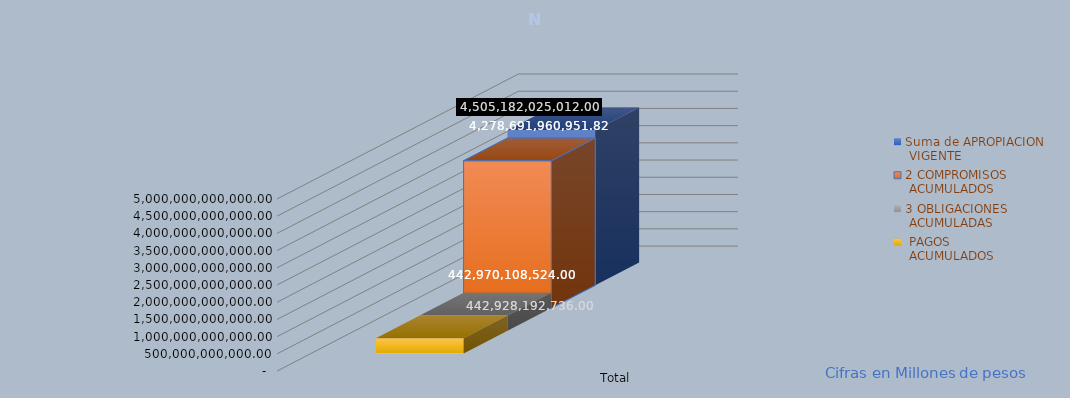
| Category | Suma de APROPIACION
 VIGENTE | 2 COMPROMISOS
 ACUMULADOS | 3 OBLIGACIONES
 ACUMULADAS |  PAGOS
 ACUMULADOS |
|---|---|---|---|---|
| Total | 4505182025012 | 4278691960951.82 | 442970108524 | 442928192736 |